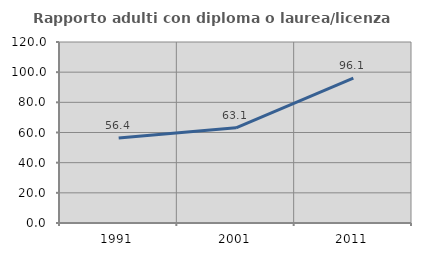
| Category | Rapporto adulti con diploma o laurea/licenza media  |
|---|---|
| 1991.0 | 56.366 |
| 2001.0 | 63.126 |
| 2011.0 | 96.081 |